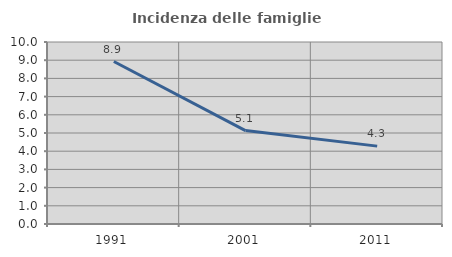
| Category | Incidenza delle famiglie numerose |
|---|---|
| 1991.0 | 8.927 |
| 2001.0 | 5.134 |
| 2011.0 | 4.279 |